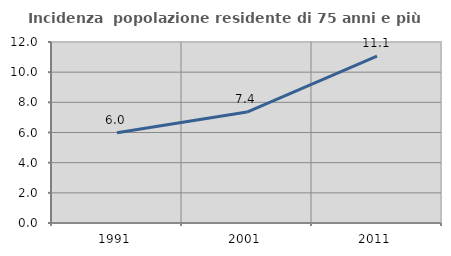
| Category | Incidenza  popolazione residente di 75 anni e più |
|---|---|
| 1991.0 | 5.986 |
| 2001.0 | 7.357 |
| 2011.0 | 11.062 |